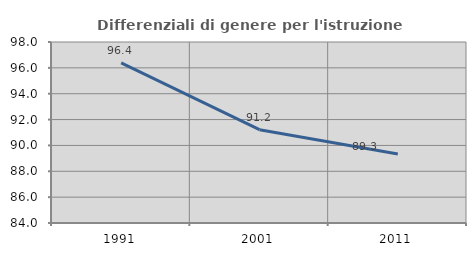
| Category | Differenziali di genere per l'istruzione superiore |
|---|---|
| 1991.0 | 96.385 |
| 2001.0 | 91.22 |
| 2011.0 | 89.34 |